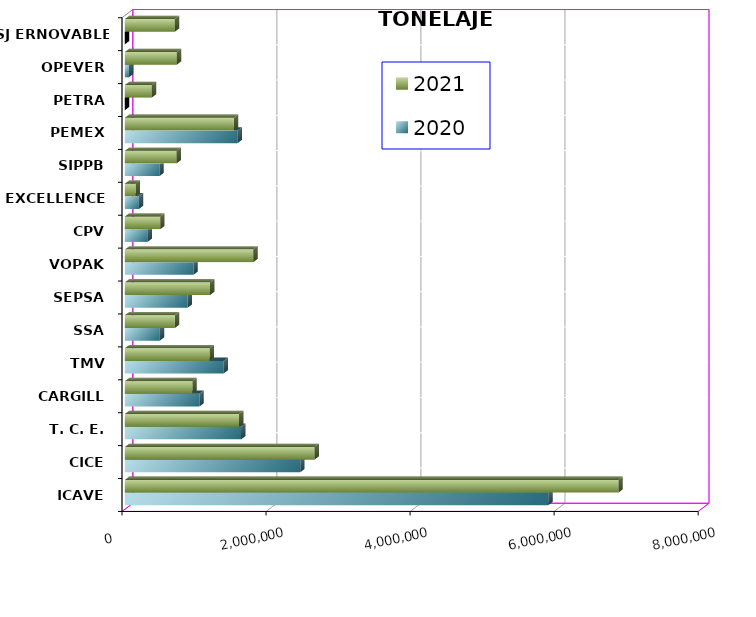
| Category | 2020 | 2021 |
|---|---|---|
| ICAVE | 5879936.42 | 6854497.135 |
| CICE | 2434812.66 | 2634677.247 |
| T. C. E. | 1614494.284 | 1585836.917 |
| CARGILL | 1036952.356 | 939577.06 |
| TMV | 1370967.457 | 1179379.15 |
| SSA | 486633.37 | 695247.838 |
| SEPSA | 872456.53 | 1183461.52 |
| VOPAK | 953411.304 | 1784179.678 |
| CPV | 316041.86 | 492065.108 |
| EXCELLENCE | 195862.233 | 150407.18 |
| SIPPB | 481886.273 | 718896.158 |
| PEMEX | 1565817.905 | 1514010.424 |
| PETRA | 0 | 374709.38 |
| OPEVER | 57330.017 | 722357.386 |
| ESJ ERNOVABLE III | 0 | 694344.61 |